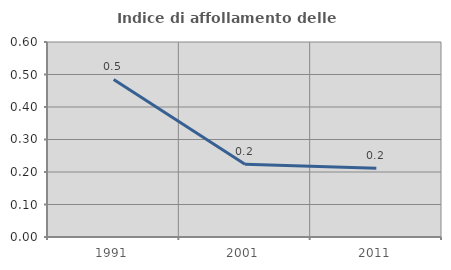
| Category | Indice di affollamento delle abitazioni  |
|---|---|
| 1991.0 | 0.485 |
| 2001.0 | 0.224 |
| 2011.0 | 0.211 |